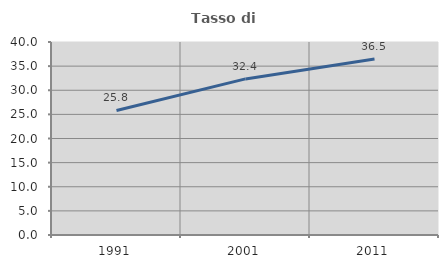
| Category | Tasso di occupazione   |
|---|---|
| 1991.0 | 25.806 |
| 2001.0 | 32.353 |
| 2011.0 | 36.489 |